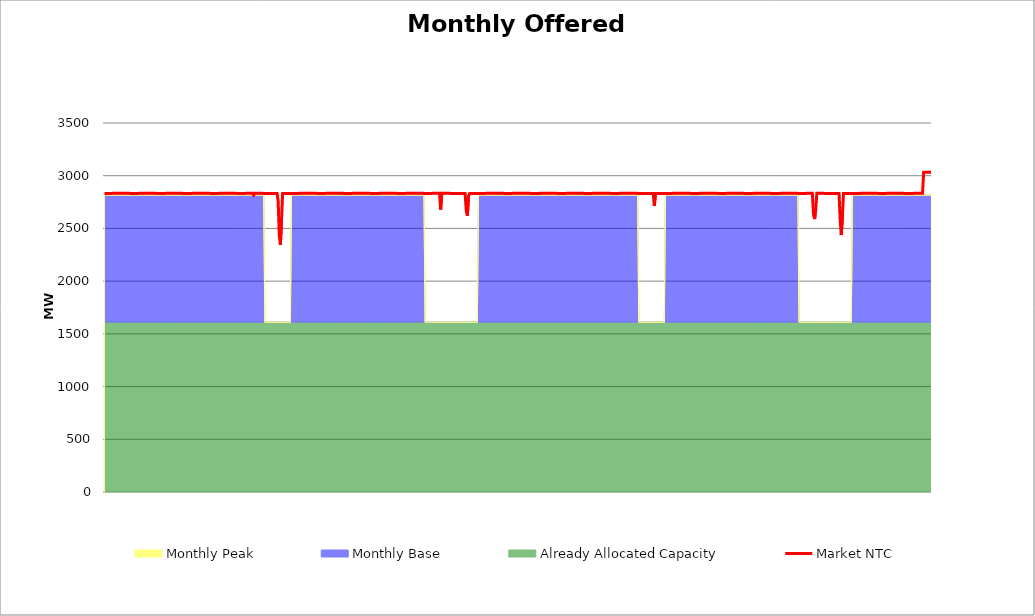
| Category | Market NTC |
|---|---|
| 0 | 2832 |
| 1 | 2832 |
| 2 | 2832 |
| 3 | 2832 |
| 4 | 2832 |
| 5 | 2832 |
| 6 | 2832 |
| 7 | 2833 |
| 8 | 2833 |
| 9 | 2833 |
| 10 | 2833 |
| 11 | 2833 |
| 12 | 2833 |
| 13 | 2833 |
| 14 | 2833 |
| 15 | 2833 |
| 16 | 2833 |
| 17 | 2833 |
| 18 | 2833 |
| 19 | 2833 |
| 20 | 2833 |
| 21 | 2833 |
| 22 | 2833 |
| 23 | 2832 |
| 24 | 2832 |
| 25 | 2832 |
| 26 | 2832 |
| 27 | 2832 |
| 28 | 2832 |
| 29 | 2832 |
| 30 | 2832 |
| 31 | 2833 |
| 32 | 2833 |
| 33 | 2833 |
| 34 | 2833 |
| 35 | 2833 |
| 36 | 2833 |
| 37 | 2833 |
| 38 | 2833 |
| 39 | 2833 |
| 40 | 2833 |
| 41 | 2833 |
| 42 | 2833 |
| 43 | 2833 |
| 44 | 2833 |
| 45 | 2833 |
| 46 | 2833 |
| 47 | 2832 |
| 48 | 2832 |
| 49 | 2832 |
| 50 | 2832 |
| 51 | 2832 |
| 52 | 2832 |
| 53 | 2832 |
| 54 | 2832 |
| 55 | 2833 |
| 56 | 2833 |
| 57 | 2833 |
| 58 | 2833 |
| 59 | 2833 |
| 60 | 2833 |
| 61 | 2833 |
| 62 | 2833 |
| 63 | 2833 |
| 64 | 2833 |
| 65 | 2833 |
| 66 | 2833 |
| 67 | 2833 |
| 68 | 2833 |
| 69 | 2833 |
| 70 | 2833 |
| 71 | 2832 |
| 72 | 2832 |
| 73 | 2832 |
| 74 | 2832 |
| 75 | 2832 |
| 76 | 2832 |
| 77 | 2832 |
| 78 | 2832 |
| 79 | 2833 |
| 80 | 2833 |
| 81 | 2833 |
| 82 | 2833 |
| 83 | 2833 |
| 84 | 2833 |
| 85 | 2833 |
| 86 | 2833 |
| 87 | 2833 |
| 88 | 2833 |
| 89 | 2833 |
| 90 | 2833 |
| 91 | 2833 |
| 92 | 2833 |
| 93 | 2833 |
| 94 | 2833 |
| 95 | 2832 |
| 96 | 2832 |
| 97 | 2832 |
| 98 | 2832 |
| 99 | 2832 |
| 100 | 2832 |
| 101 | 2832 |
| 102 | 2832 |
| 103 | 2833 |
| 104 | 2833 |
| 105 | 2833 |
| 106 | 2833 |
| 107 | 2833 |
| 108 | 2833 |
| 109 | 2833 |
| 110 | 2833 |
| 111 | 2833 |
| 112 | 2833 |
| 113 | 2833 |
| 114 | 2833 |
| 115 | 2833 |
| 116 | 2833 |
| 117 | 2833 |
| 118 | 2833 |
| 119 | 2832 |
| 120 | 2832 |
| 121 | 2832 |
| 122 | 2832 |
| 123 | 2832 |
| 124 | 2832 |
| 125 | 2832 |
| 126 | 2832 |
| 127 | 2833 |
| 128 | 2833 |
| 129 | 2833 |
| 130 | 2833 |
| 131 | 2833 |
| 132 | 2833 |
| 133 | 2833 |
| 134 | 2816 |
| 135 | 2833 |
| 136 | 2833 |
| 137 | 2833 |
| 138 | 2833 |
| 139 | 2833 |
| 140 | 2833 |
| 141 | 2833 |
| 142 | 2833 |
| 143 | 2832 |
| 144 | 2832 |
| 145 | 2832 |
| 146 | 2832 |
| 147 | 2832 |
| 148 | 2832 |
| 149 | 2832 |
| 150 | 2832 |
| 151 | 2832 |
| 152 | 2832 |
| 153 | 2832 |
| 154 | 2832 |
| 155 | 2832 |
| 156 | 2759 |
| 157 | 2437 |
| 158 | 2345 |
| 159 | 2575 |
| 160 | 2832 |
| 161 | 2832 |
| 162 | 2832 |
| 163 | 2832 |
| 164 | 2832 |
| 165 | 2832 |
| 166 | 2832 |
| 167 | 2832 |
| 168 | 2832 |
| 169 | 2832 |
| 170 | 2832 |
| 171 | 2832 |
| 172 | 2832 |
| 173 | 2832 |
| 174 | 2832 |
| 175 | 2833 |
| 176 | 2833 |
| 177 | 2833 |
| 178 | 2833 |
| 179 | 2833 |
| 180 | 2833 |
| 181 | 2833 |
| 182 | 2833 |
| 183 | 2833 |
| 184 | 2833 |
| 185 | 2833 |
| 186 | 2833 |
| 187 | 2833 |
| 188 | 2833 |
| 189 | 2833 |
| 190 | 2833 |
| 191 | 2832 |
| 192 | 2832 |
| 193 | 2832 |
| 194 | 2832 |
| 195 | 2832 |
| 196 | 2832 |
| 197 | 2832 |
| 198 | 2832 |
| 199 | 2833 |
| 200 | 2833 |
| 201 | 2833 |
| 202 | 2833 |
| 203 | 2833 |
| 204 | 2833 |
| 205 | 2833 |
| 206 | 2833 |
| 207 | 2833 |
| 208 | 2833 |
| 209 | 2833 |
| 210 | 2833 |
| 211 | 2833 |
| 212 | 2833 |
| 213 | 2833 |
| 214 | 2833 |
| 215 | 2832 |
| 216 | 2832 |
| 217 | 2832 |
| 218 | 2832 |
| 219 | 2832 |
| 220 | 2832 |
| 221 | 2832 |
| 222 | 2832 |
| 223 | 2833 |
| 224 | 2833 |
| 225 | 2833 |
| 226 | 2833 |
| 227 | 2833 |
| 228 | 2833 |
| 229 | 2833 |
| 230 | 2833 |
| 231 | 2833 |
| 232 | 2833 |
| 233 | 2833 |
| 234 | 2833 |
| 235 | 2833 |
| 236 | 2833 |
| 237 | 2833 |
| 238 | 2833 |
| 239 | 2832 |
| 240 | 2832 |
| 241 | 2832 |
| 242 | 2832 |
| 243 | 2832 |
| 244 | 2832 |
| 245 | 2832 |
| 246 | 2832 |
| 247 | 2833 |
| 248 | 2833 |
| 249 | 2833 |
| 250 | 2833 |
| 251 | 2833 |
| 252 | 2833 |
| 253 | 2833 |
| 254 | 2833 |
| 255 | 2833 |
| 256 | 2833 |
| 257 | 2833 |
| 258 | 2833 |
| 259 | 2833 |
| 260 | 2833 |
| 261 | 2833 |
| 262 | 2833 |
| 263 | 2832 |
| 264 | 2832 |
| 265 | 2832 |
| 266 | 2832 |
| 267 | 2832 |
| 268 | 2832 |
| 269 | 2832 |
| 270 | 2832 |
| 271 | 2833 |
| 272 | 2833 |
| 273 | 2833 |
| 274 | 2833 |
| 275 | 2833 |
| 276 | 2833 |
| 277 | 2833 |
| 278 | 2833 |
| 279 | 2833 |
| 280 | 2833 |
| 281 | 2833 |
| 282 | 2833 |
| 283 | 2833 |
| 284 | 2833 |
| 285 | 2833 |
| 286 | 2833 |
| 287 | 2832 |
| 288 | 2832 |
| 289 | 2832 |
| 290 | 2832 |
| 291 | 2832 |
| 292 | 2832 |
| 293 | 2832 |
| 294 | 2832 |
| 295 | 2833 |
| 296 | 2833 |
| 297 | 2833 |
| 298 | 2833 |
| 299 | 2833 |
| 300 | 2833 |
| 301 | 2833 |
| 302 | 2679 |
| 303 | 2833 |
| 304 | 2833 |
| 305 | 2833 |
| 306 | 2833 |
| 307 | 2833 |
| 308 | 2833 |
| 309 | 2833 |
| 310 | 2833 |
| 311 | 2832 |
| 312 | 2832 |
| 313 | 2832 |
| 314 | 2832 |
| 315 | 2832 |
| 316 | 2832 |
| 317 | 2832 |
| 318 | 2832 |
| 319 | 2832 |
| 320 | 2832 |
| 321 | 2832 |
| 322 | 2832 |
| 323 | 2832 |
| 324 | 2832 |
| 325 | 2667 |
| 326 | 2621 |
| 327 | 2805 |
| 328 | 2832 |
| 329 | 2832 |
| 330 | 2832 |
| 331 | 2832 |
| 332 | 2832 |
| 333 | 2832 |
| 334 | 2832 |
| 335 | 2832 |
| 336 | 2832 |
| 337 | 2832 |
| 338 | 2832 |
| 339 | 2832 |
| 340 | 2832 |
| 341 | 2832 |
| 342 | 2832 |
| 343 | 2833 |
| 344 | 2833 |
| 345 | 2833 |
| 346 | 2833 |
| 347 | 2833 |
| 348 | 2833 |
| 349 | 2833 |
| 350 | 2833 |
| 351 | 2833 |
| 352 | 2833 |
| 353 | 2833 |
| 354 | 2833 |
| 355 | 2833 |
| 356 | 2833 |
| 357 | 2833 |
| 358 | 2833 |
| 359 | 2832 |
| 360 | 2832 |
| 361 | 2832 |
| 362 | 2832 |
| 363 | 2832 |
| 364 | 2832 |
| 365 | 2832 |
| 366 | 2832 |
| 367 | 2833 |
| 368 | 2833 |
| 369 | 2833 |
| 370 | 2833 |
| 371 | 2833 |
| 372 | 2833 |
| 373 | 2833 |
| 374 | 2833 |
| 375 | 2833 |
| 376 | 2833 |
| 377 | 2833 |
| 378 | 2833 |
| 379 | 2833 |
| 380 | 2833 |
| 381 | 2833 |
| 382 | 2833 |
| 383 | 2832 |
| 384 | 2832 |
| 385 | 2832 |
| 386 | 2832 |
| 387 | 2832 |
| 388 | 2832 |
| 389 | 2832 |
| 390 | 2832 |
| 391 | 2833 |
| 392 | 2833 |
| 393 | 2833 |
| 394 | 2833 |
| 395 | 2833 |
| 396 | 2833 |
| 397 | 2833 |
| 398 | 2833 |
| 399 | 2833 |
| 400 | 2833 |
| 401 | 2833 |
| 402 | 2833 |
| 403 | 2833 |
| 404 | 2833 |
| 405 | 2833 |
| 406 | 2833 |
| 407 | 2832 |
| 408 | 2832 |
| 409 | 2832 |
| 410 | 2832 |
| 411 | 2832 |
| 412 | 2832 |
| 413 | 2832 |
| 414 | 2832 |
| 415 | 2833 |
| 416 | 2833 |
| 417 | 2833 |
| 418 | 2833 |
| 419 | 2833 |
| 420 | 2833 |
| 421 | 2833 |
| 422 | 2833 |
| 423 | 2833 |
| 424 | 2833 |
| 425 | 2833 |
| 426 | 2833 |
| 427 | 2833 |
| 428 | 2833 |
| 429 | 2833 |
| 430 | 2833 |
| 431 | 2832 |
| 432 | 2832 |
| 433 | 2832 |
| 434 | 2832 |
| 435 | 2832 |
| 436 | 2832 |
| 437 | 2832 |
| 438 | 2832 |
| 439 | 2833 |
| 440 | 2833 |
| 441 | 2833 |
| 442 | 2833 |
| 443 | 2833 |
| 444 | 2833 |
| 445 | 2833 |
| 446 | 2833 |
| 447 | 2833 |
| 448 | 2833 |
| 449 | 2833 |
| 450 | 2833 |
| 451 | 2833 |
| 452 | 2833 |
| 453 | 2833 |
| 454 | 2833 |
| 455 | 2832 |
| 456 | 2832 |
| 457 | 2832 |
| 458 | 2832 |
| 459 | 2832 |
| 460 | 2832 |
| 461 | 2832 |
| 462 | 2832 |
| 463 | 2833 |
| 464 | 2833 |
| 465 | 2833 |
| 466 | 2833 |
| 467 | 2833 |
| 468 | 2833 |
| 469 | 2833 |
| 470 | 2833 |
| 471 | 2833 |
| 472 | 2833 |
| 473 | 2833 |
| 474 | 2833 |
| 475 | 2833 |
| 476 | 2833 |
| 477 | 2833 |
| 478 | 2833 |
| 479 | 2832 |
| 480 | 2832 |
| 481 | 2832 |
| 482 | 2832 |
| 483 | 2832 |
| 484 | 2832 |
| 485 | 2832 |
| 486 | 2832 |
| 487 | 2832 |
| 488 | 2832 |
| 489 | 2832 |
| 490 | 2832 |
| 491 | 2832 |
| 492 | 2832 |
| 493 | 2832 |
| 494 | 2713 |
| 495 | 2832 |
| 496 | 2832 |
| 497 | 2832 |
| 498 | 2832 |
| 499 | 2832 |
| 500 | 2832 |
| 501 | 2832 |
| 502 | 2832 |
| 503 | 2832 |
| 504 | 2832 |
| 505 | 2832 |
| 506 | 2832 |
| 507 | 2832 |
| 508 | 2832 |
| 509 | 2832 |
| 510 | 2832 |
| 511 | 2833 |
| 512 | 2833 |
| 513 | 2833 |
| 514 | 2833 |
| 515 | 2833 |
| 516 | 2833 |
| 517 | 2833 |
| 518 | 2833 |
| 519 | 2833 |
| 520 | 2833 |
| 521 | 2833 |
| 522 | 2833 |
| 523 | 2833 |
| 524 | 2833 |
| 525 | 2833 |
| 526 | 2833 |
| 527 | 2832 |
| 528 | 2832 |
| 529 | 2832 |
| 530 | 2832 |
| 531 | 2832 |
| 532 | 2832 |
| 533 | 2832 |
| 534 | 2832 |
| 535 | 2833 |
| 536 | 2833 |
| 537 | 2833 |
| 538 | 2833 |
| 539 | 2833 |
| 540 | 2833 |
| 541 | 2833 |
| 542 | 2833 |
| 543 | 2833 |
| 544 | 2833 |
| 545 | 2833 |
| 546 | 2833 |
| 547 | 2833 |
| 548 | 2833 |
| 549 | 2833 |
| 550 | 2833 |
| 551 | 2832 |
| 552 | 2832 |
| 553 | 2832 |
| 554 | 2832 |
| 555 | 2832 |
| 556 | 2832 |
| 557 | 2832 |
| 558 | 2832 |
| 559 | 2833 |
| 560 | 2833 |
| 561 | 2833 |
| 562 | 2833 |
| 563 | 2833 |
| 564 | 2833 |
| 565 | 2833 |
| 566 | 2833 |
| 567 | 2833 |
| 568 | 2833 |
| 569 | 2833 |
| 570 | 2833 |
| 571 | 2833 |
| 572 | 2833 |
| 573 | 2833 |
| 574 | 2833 |
| 575 | 2832 |
| 576 | 2832 |
| 577 | 2832 |
| 578 | 2832 |
| 579 | 2832 |
| 580 | 2832 |
| 581 | 2832 |
| 582 | 2832 |
| 583 | 2833 |
| 584 | 2833 |
| 585 | 2833 |
| 586 | 2833 |
| 587 | 2833 |
| 588 | 2833 |
| 589 | 2833 |
| 590 | 2833 |
| 591 | 2833 |
| 592 | 2833 |
| 593 | 2833 |
| 594 | 2833 |
| 595 | 2833 |
| 596 | 2833 |
| 597 | 2833 |
| 598 | 2833 |
| 599 | 2832 |
| 600 | 2832 |
| 601 | 2832 |
| 602 | 2832 |
| 603 | 2832 |
| 604 | 2832 |
| 605 | 2832 |
| 606 | 2832 |
| 607 | 2833 |
| 608 | 2833 |
| 609 | 2833 |
| 610 | 2833 |
| 611 | 2833 |
| 612 | 2833 |
| 613 | 2833 |
| 614 | 2833 |
| 615 | 2833 |
| 616 | 2833 |
| 617 | 2833 |
| 618 | 2833 |
| 619 | 2833 |
| 620 | 2833 |
| 621 | 2833 |
| 622 | 2833 |
| 623 | 2832 |
| 624 | 2832 |
| 625 | 2832 |
| 626 | 2832 |
| 627 | 2832 |
| 628 | 2832 |
| 629 | 2832 |
| 630 | 2832 |
| 631 | 2833 |
| 632 | 2833 |
| 633 | 2833 |
| 634 | 2833 |
| 635 | 2833 |
| 636 | 2833 |
| 637 | 2634 |
| 638 | 2589 |
| 639 | 2679 |
| 640 | 2833 |
| 641 | 2833 |
| 642 | 2833 |
| 643 | 2833 |
| 644 | 2833 |
| 645 | 2833 |
| 646 | 2833 |
| 647 | 2832 |
| 648 | 2832 |
| 649 | 2832 |
| 650 | 2832 |
| 651 | 2832 |
| 652 | 2832 |
| 653 | 2832 |
| 654 | 2832 |
| 655 | 2832 |
| 656 | 2832 |
| 657 | 2832 |
| 658 | 2832 |
| 659 | 2832 |
| 660 | 2832 |
| 661 | 2575 |
| 662 | 2437 |
| 663 | 2621 |
| 664 | 2832 |
| 665 | 2832 |
| 666 | 2832 |
| 667 | 2832 |
| 668 | 2832 |
| 669 | 2832 |
| 670 | 2832 |
| 671 | 2832 |
| 672 | 2832 |
| 673 | 2832 |
| 674 | 2832 |
| 675 | 2832 |
| 676 | 2832 |
| 677 | 2832 |
| 678 | 2832 |
| 679 | 2833 |
| 680 | 2833 |
| 681 | 2833 |
| 682 | 2833 |
| 683 | 2833 |
| 684 | 2833 |
| 685 | 2833 |
| 686 | 2833 |
| 687 | 2833 |
| 688 | 2833 |
| 689 | 2833 |
| 690 | 2833 |
| 691 | 2833 |
| 692 | 2833 |
| 693 | 2833 |
| 694 | 2833 |
| 695 | 2832 |
| 696 | 2832 |
| 697 | 2832 |
| 698 | 2832 |
| 699 | 2832 |
| 700 | 2832 |
| 701 | 2832 |
| 702 | 2832 |
| 703 | 2833 |
| 704 | 2833 |
| 705 | 2833 |
| 706 | 2833 |
| 707 | 2833 |
| 708 | 2833 |
| 709 | 2833 |
| 710 | 2833 |
| 711 | 2833 |
| 712 | 2833 |
| 713 | 2833 |
| 714 | 2833 |
| 715 | 2833 |
| 716 | 2833 |
| 717 | 2833 |
| 718 | 2833 |
| 719 | 2832 |
| 720 | 2832 |
| 721 | 2832 |
| 722 | 2832 |
| 723 | 2832 |
| 724 | 2832 |
| 725 | 2832 |
| 726 | 2832 |
| 727 | 2833 |
| 728 | 2833 |
| 729 | 2833 |
| 730 | 2833 |
| 731 | 2833 |
| 732 | 2833 |
| 733 | 2833 |
| 734 | 2833 |
| 735 | 2833 |
| 736 | 3033 |
| 737 | 3033 |
| 738 | 3033 |
| 739 | 3033 |
| 740 | 3033 |
| 741 | 3033 |
| 742 | 3033 |
| 743 | 3032 |